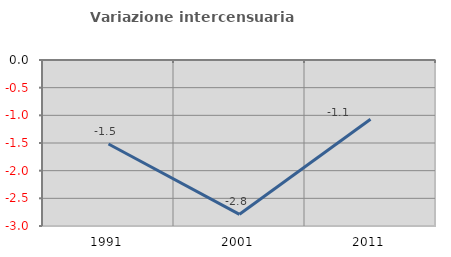
| Category | Variazione intercensuaria annua |
|---|---|
| 1991.0 | -1.518 |
| 2001.0 | -2.789 |
| 2011.0 | -1.072 |